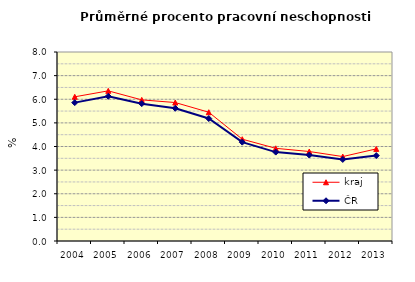
| Category | kraj | ČR |
|---|---|---|
| 2004.0 | 6.103 | 5.857 |
| 2005.0 | 6.356 | 6.126 |
| 2006.0 | 5.973 | 5.814 |
| 2007.0 | 5.861 | 5.619 |
| 2008.0 | 5.451 | 5.184 |
| 2009.0 | 4.309 | 4.184 |
| 2010.0 | 3.923 | 3.763 |
| 2011.0 | 3.788 | 3.638 |
| 2012.0 | 3.574 | 3.452 |
| 2013.0 | 3.899 | 3.615 |